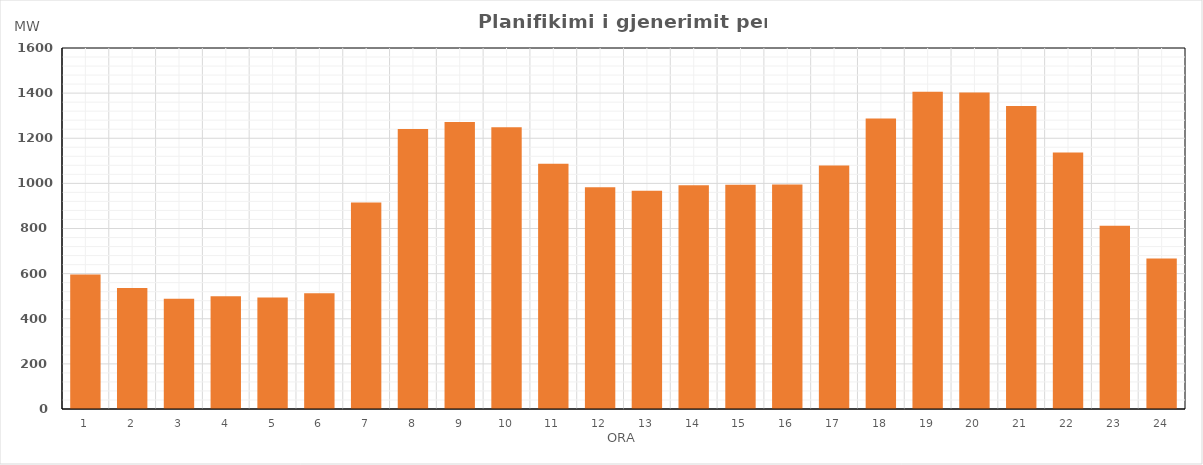
| Category | Max (MW) |
|---|---|
| 0 | 595.648 |
| 1 | 536.393 |
| 2 | 488.977 |
| 3 | 499.755 |
| 4 | 494.371 |
| 5 | 513.309 |
| 6 | 915.754 |
| 7 | 1240.511 |
| 8 | 1271.772 |
| 9 | 1248.517 |
| 10 | 1087.377 |
| 11 | 983.062 |
| 12 | 967.752 |
| 13 | 991.533 |
| 14 | 994.208 |
| 15 | 994.633 |
| 16 | 1079.299 |
| 17 | 1287.064 |
| 18 | 1405.751 |
| 19 | 1403.092 |
| 20 | 1343.242 |
| 21 | 1137.39 |
| 22 | 812.627 |
| 23 | 667.532 |